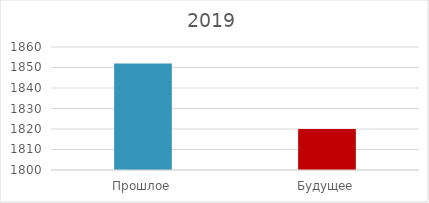
| Category | Series 0 |
|---|---|
| Прошлое | 1852 |
| Будущее | 1820 |